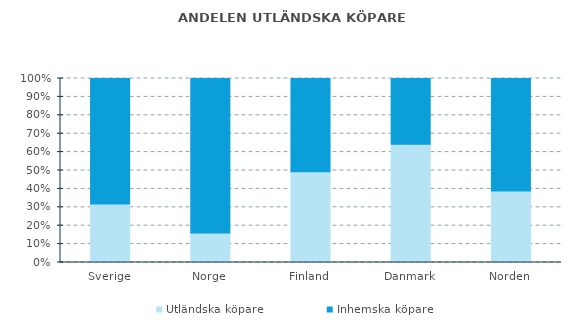
| Category | Utländska köpare | Inhemska köpare |
|---|---|---|
| Sverige | 0.317 | 0.683 |
| Norge | 0.16 | 0.84 |
| Finland | 0.493 | 0.507 |
| Danmark | 0.643 | 0.357 |
| Norden | 0.388 | 0.612 |